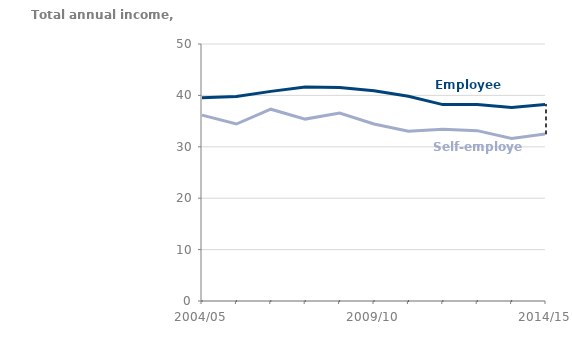
| Category | Employees | Self-employed |
|---|---|---|
| 2004/05 | 39548 | 36155 |
| 2005/06 | 39772 | 34432 |
| 2006/07 | 40785 | 37313 |
| 2007/08 | 41626 | 35390 |
| 2008/09 | 41555 | 36580 |
| 2009/10 | 40924 | 34433 |
| 2010/11 | 39842 | 33044 |
| 2011/12 | 38208 | 33422 |
| 2012/13 | 38226 | 33146 |
| 2013/14 | 37641 | 31607 |
| 2014/15 | 38263 | 32507 |